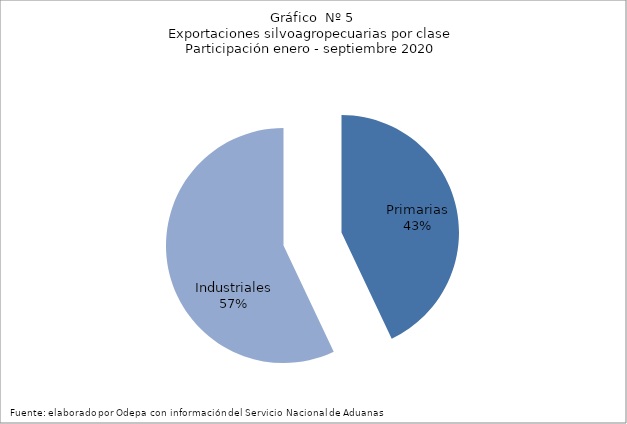
| Category | Series 0 |
|---|---|
| Primarias | 5155632 |
| Industriales | 6842693 |